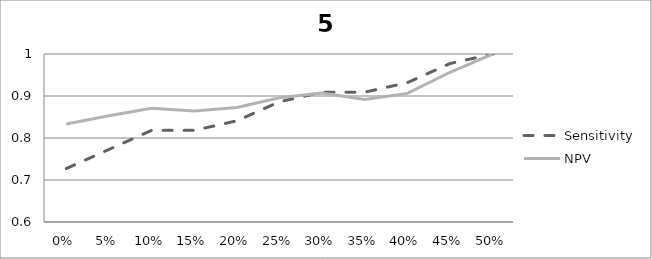
| Category | Sensitivity | NPV |
|---|---|---|
| 0.0 | 0.727 | 0.833 |
| 0.05 | 0.773 | 0.853 |
| 0.1 | 0.818 | 0.871 |
| 0.15 | 0.818 | 0.864 |
| 0.2 | 0.841 | 0.873 |
| 0.25 | 0.886 | 0.896 |
| 0.3 | 0.909 | 0.907 |
| 0.35 | 0.909 | 0.892 |
| 0.4 | 0.932 | 0.906 |
| 0.45 | 0.977 | 0.957 |
| 0.5 | 1 | 1 |